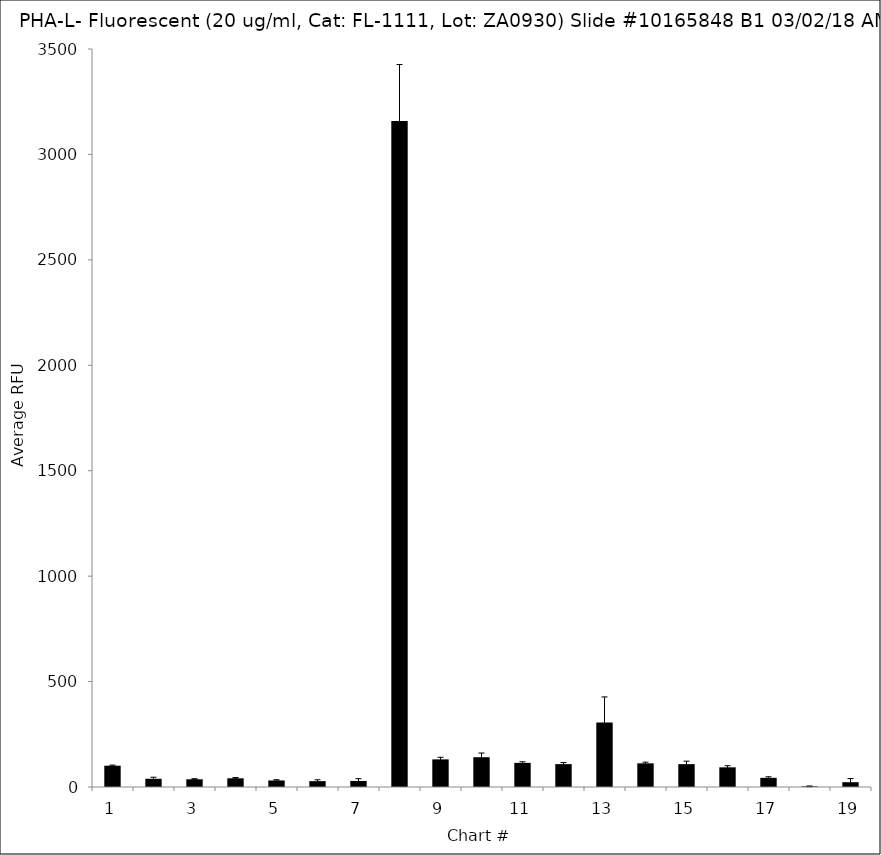
| Category | Series 0 |
|---|---|
| 1.0 | 101 |
| 2.0 | 39 |
| 3.0 | 36.5 |
| 4.0 | 41.25 |
| 5.0 | 31 |
| 6.0 | 27.75 |
| 7.0 | 28.75 |
| 8.0 | 3158 |
| 9.0 | 131 |
| 10.0 | 141.25 |
| 11.0 | 114.5 |
| 12.0 | 108.5 |
| 13.0 | 305.5 |
| 14.0 | 112.25 |
| 15.0 | 108.5 |
| 16.0 | 93.25 |
| 17.0 | 43.5 |
| 18.0 | 3 |
| 19.0 | 22.75 |